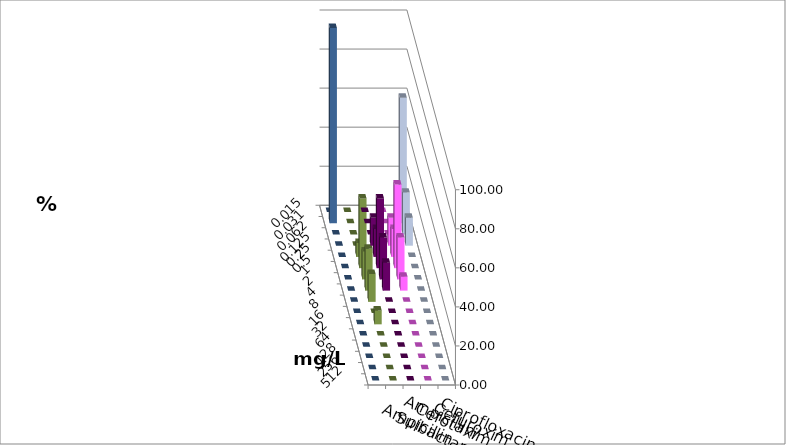
| Category | Ampicillin | Ampicillin/ Sulbactam | Cefotaxim | Cefuroxim | Ciprofloxacin |
|---|---|---|---|---|---|
| 0.015 | 0 | 0 | 0 | 0 | 0 |
| 0.031 | 0 | 0 | 64.286 | 0 | 100 |
| 0.062 | 0 | 0 | 21.429 | 0 | 0 |
| 0.125 | 14.286 | 14.286 | 14.286 | 0 | 0 |
| 0.25 | 14.286 | 14.286 | 0 | 7.143 | 0 |
| 0.5 | 35.714 | 42.857 | 0 | 35.714 | 0 |
| 1.0 | 21.429 | 21.429 | 0 | 14.286 | 0 |
| 2.0 | 14.286 | 7.143 | 0 | 21.429 | 0 |
| 4.0 | 0 | 0 | 0 | 14.286 | 0 |
| 8.0 | 0 | 0 | 0 | 0 | 0 |
| 16.0 | 0 | 0 | 0 | 7.143 | 0 |
| 32.0 | 0 | 0 | 0 | 0 | 0 |
| 64.0 | 0 | 0 | 0 | 0 | 0 |
| 128.0 | 0 | 0 | 0 | 0 | 0 |
| 256.0 | 0 | 0 | 0 | 0 | 0 |
| 512.0 | 0 | 0 | 0 | 0 | 0 |